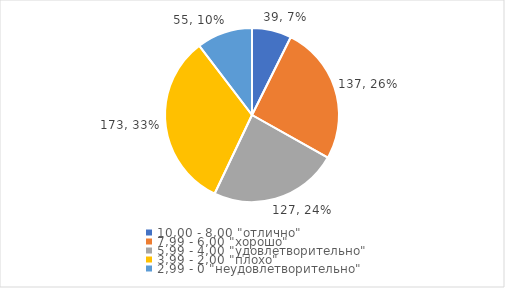
| Category | Series 0 | Series 1 |
|---|---|---|
| 10,00 - 8,00 "отлично" | 39 | 0.073 |
| 7,99 - 6,00 "хорошо" | 137 | 0.258 |
| 5,99 - 4,00 "удовлетворительно" | 127 | 0.239 |
| 3,99 - 2,00 "плохо" | 173 | 0.326 |
| 2,99 - 0 "неудовлетворительно" | 55 | 0.104 |